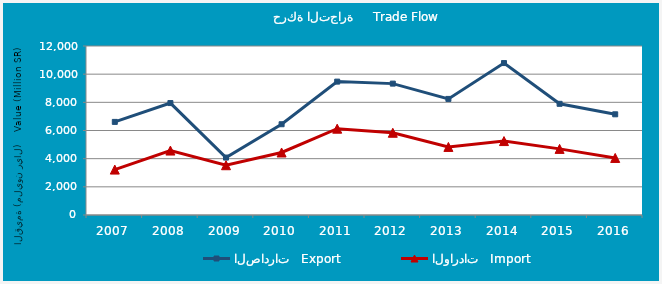
| Category | الصادرات   Export | الواردات   Import |
|---|---|---|
| 2007.0 | 6610.933 | 3224.801 |
| 2008.0 | 7948.122 | 4576.529 |
| 2009.0 | 4078.024 | 3534.175 |
| 2010.0 | 6444.199 | 4438.736 |
| 2011.0 | 9471.039 | 6128.9 |
| 2012.0 | 9328.455 | 5840.098 |
| 2013.0 | 8243.151 | 4833.506 |
| 2014.0 | 10788.855 | 5249.591 |
| 2015.0 | 7894.132 | 4694.438 |
| 2016.0 | 7149.925 | 4051.682 |